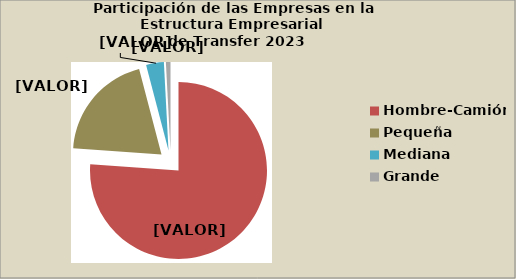
| Category | Series 0 |
|---|---|
| Hombre-Camión | 76.176 |
| Pequeña | 19.8 |
| Mediana | 3.239 |
| Grande | 0.836 |